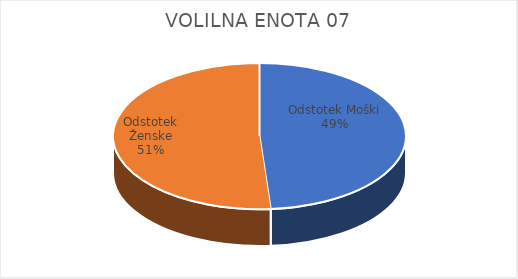
| Category | VOLILNA ENOTA 07 | #REF! | Slovenija skupaj |
|---|---|---|---|
| Odstotek Moški | 23.92 |  | 25.26 |
| Odstotek Ženske | 25.11 |  | 26.62 |